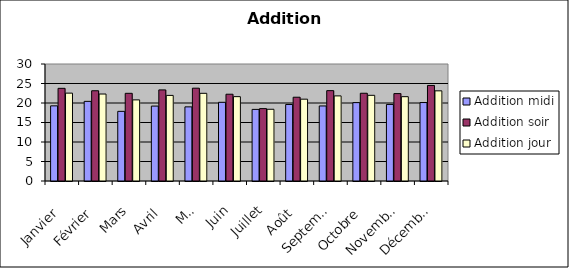
| Category | Addition |
|---|---|
| Janvier | 22.53 |
| Février | 22.3 |
| Mars | 20.8 |
| Avril | 21.95 |
| Mai | 22.48 |
| Juin | 21.63 |
| Juillet | 18.39 |
| Août | 20.98 |
| Septembre | 21.82 |
| Octobre | 21.97 |
| Novembre | 21.62 |
| Décembre | 23.12 |